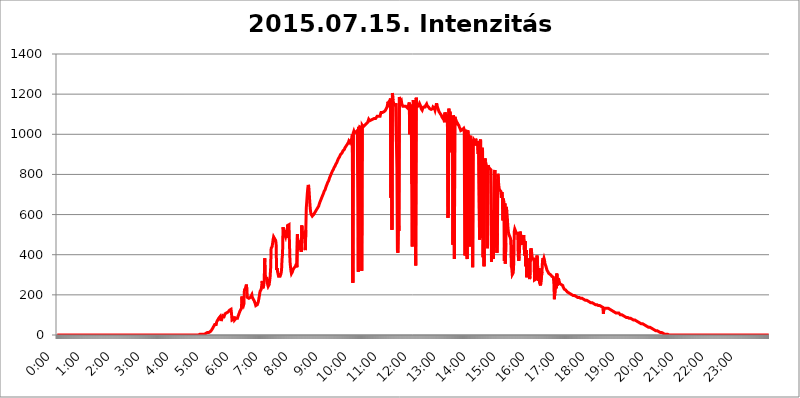
| Category | 2015.07.15. Intenzitás [W/m^2] |
|---|---|
| 0.0 | 0 |
| 0.0006944444444444445 | 0 |
| 0.001388888888888889 | 0 |
| 0.0020833333333333333 | 0 |
| 0.002777777777777778 | 0 |
| 0.003472222222222222 | 0 |
| 0.004166666666666667 | 0 |
| 0.004861111111111111 | 0 |
| 0.005555555555555556 | 0 |
| 0.0062499999999999995 | 0 |
| 0.006944444444444444 | 0 |
| 0.007638888888888889 | 0 |
| 0.008333333333333333 | 0 |
| 0.009027777777777779 | 0 |
| 0.009722222222222222 | 0 |
| 0.010416666666666666 | 0 |
| 0.011111111111111112 | 0 |
| 0.011805555555555555 | 0 |
| 0.012499999999999999 | 0 |
| 0.013194444444444444 | 0 |
| 0.013888888888888888 | 0 |
| 0.014583333333333332 | 0 |
| 0.015277777777777777 | 0 |
| 0.015972222222222224 | 0 |
| 0.016666666666666666 | 0 |
| 0.017361111111111112 | 0 |
| 0.018055555555555557 | 0 |
| 0.01875 | 0 |
| 0.019444444444444445 | 0 |
| 0.02013888888888889 | 0 |
| 0.020833333333333332 | 0 |
| 0.02152777777777778 | 0 |
| 0.022222222222222223 | 0 |
| 0.02291666666666667 | 0 |
| 0.02361111111111111 | 0 |
| 0.024305555555555556 | 0 |
| 0.024999999999999998 | 0 |
| 0.025694444444444447 | 0 |
| 0.02638888888888889 | 0 |
| 0.027083333333333334 | 0 |
| 0.027777777777777776 | 0 |
| 0.02847222222222222 | 0 |
| 0.029166666666666664 | 0 |
| 0.029861111111111113 | 0 |
| 0.030555555555555555 | 0 |
| 0.03125 | 0 |
| 0.03194444444444445 | 0 |
| 0.03263888888888889 | 0 |
| 0.03333333333333333 | 0 |
| 0.034027777777777775 | 0 |
| 0.034722222222222224 | 0 |
| 0.035416666666666666 | 0 |
| 0.036111111111111115 | 0 |
| 0.03680555555555556 | 0 |
| 0.0375 | 0 |
| 0.03819444444444444 | 0 |
| 0.03888888888888889 | 0 |
| 0.03958333333333333 | 0 |
| 0.04027777777777778 | 0 |
| 0.04097222222222222 | 0 |
| 0.041666666666666664 | 0 |
| 0.042361111111111106 | 0 |
| 0.04305555555555556 | 0 |
| 0.043750000000000004 | 0 |
| 0.044444444444444446 | 0 |
| 0.04513888888888889 | 0 |
| 0.04583333333333334 | 0 |
| 0.04652777777777778 | 0 |
| 0.04722222222222222 | 0 |
| 0.04791666666666666 | 0 |
| 0.04861111111111111 | 0 |
| 0.049305555555555554 | 0 |
| 0.049999999999999996 | 0 |
| 0.05069444444444445 | 0 |
| 0.051388888888888894 | 0 |
| 0.052083333333333336 | 0 |
| 0.05277777777777778 | 0 |
| 0.05347222222222222 | 0 |
| 0.05416666666666667 | 0 |
| 0.05486111111111111 | 0 |
| 0.05555555555555555 | 0 |
| 0.05625 | 0 |
| 0.05694444444444444 | 0 |
| 0.057638888888888885 | 0 |
| 0.05833333333333333 | 0 |
| 0.05902777777777778 | 0 |
| 0.059722222222222225 | 0 |
| 0.06041666666666667 | 0 |
| 0.061111111111111116 | 0 |
| 0.06180555555555556 | 0 |
| 0.0625 | 0 |
| 0.06319444444444444 | 0 |
| 0.06388888888888888 | 0 |
| 0.06458333333333334 | 0 |
| 0.06527777777777778 | 0 |
| 0.06597222222222222 | 0 |
| 0.06666666666666667 | 0 |
| 0.06736111111111111 | 0 |
| 0.06805555555555555 | 0 |
| 0.06874999999999999 | 0 |
| 0.06944444444444443 | 0 |
| 0.07013888888888889 | 0 |
| 0.07083333333333333 | 0 |
| 0.07152777777777779 | 0 |
| 0.07222222222222223 | 0 |
| 0.07291666666666667 | 0 |
| 0.07361111111111111 | 0 |
| 0.07430555555555556 | 0 |
| 0.075 | 0 |
| 0.07569444444444444 | 0 |
| 0.0763888888888889 | 0 |
| 0.07708333333333334 | 0 |
| 0.07777777777777778 | 0 |
| 0.07847222222222222 | 0 |
| 0.07916666666666666 | 0 |
| 0.0798611111111111 | 0 |
| 0.08055555555555556 | 0 |
| 0.08125 | 0 |
| 0.08194444444444444 | 0 |
| 0.08263888888888889 | 0 |
| 0.08333333333333333 | 0 |
| 0.08402777777777777 | 0 |
| 0.08472222222222221 | 0 |
| 0.08541666666666665 | 0 |
| 0.08611111111111112 | 0 |
| 0.08680555555555557 | 0 |
| 0.08750000000000001 | 0 |
| 0.08819444444444445 | 0 |
| 0.08888888888888889 | 0 |
| 0.08958333333333333 | 0 |
| 0.09027777777777778 | 0 |
| 0.09097222222222222 | 0 |
| 0.09166666666666667 | 0 |
| 0.09236111111111112 | 0 |
| 0.09305555555555556 | 0 |
| 0.09375 | 0 |
| 0.09444444444444444 | 0 |
| 0.09513888888888888 | 0 |
| 0.09583333333333333 | 0 |
| 0.09652777777777777 | 0 |
| 0.09722222222222222 | 0 |
| 0.09791666666666667 | 0 |
| 0.09861111111111111 | 0 |
| 0.09930555555555555 | 0 |
| 0.09999999999999999 | 0 |
| 0.10069444444444443 | 0 |
| 0.1013888888888889 | 0 |
| 0.10208333333333335 | 0 |
| 0.10277777777777779 | 0 |
| 0.10347222222222223 | 0 |
| 0.10416666666666667 | 0 |
| 0.10486111111111111 | 0 |
| 0.10555555555555556 | 0 |
| 0.10625 | 0 |
| 0.10694444444444444 | 0 |
| 0.1076388888888889 | 0 |
| 0.10833333333333334 | 0 |
| 0.10902777777777778 | 0 |
| 0.10972222222222222 | 0 |
| 0.1111111111111111 | 0 |
| 0.11180555555555556 | 0 |
| 0.11180555555555556 | 0 |
| 0.1125 | 0 |
| 0.11319444444444444 | 0 |
| 0.11388888888888889 | 0 |
| 0.11458333333333333 | 0 |
| 0.11527777777777777 | 0 |
| 0.11597222222222221 | 0 |
| 0.11666666666666665 | 0 |
| 0.1173611111111111 | 0 |
| 0.11805555555555557 | 0 |
| 0.11944444444444445 | 0 |
| 0.12013888888888889 | 0 |
| 0.12083333333333333 | 0 |
| 0.12152777777777778 | 0 |
| 0.12222222222222223 | 0 |
| 0.12291666666666667 | 0 |
| 0.12291666666666667 | 0 |
| 0.12361111111111112 | 0 |
| 0.12430555555555556 | 0 |
| 0.125 | 0 |
| 0.12569444444444444 | 0 |
| 0.12638888888888888 | 0 |
| 0.12708333333333333 | 0 |
| 0.16875 | 0 |
| 0.12847222222222224 | 0 |
| 0.12916666666666668 | 0 |
| 0.12986111111111112 | 0 |
| 0.13055555555555556 | 0 |
| 0.13125 | 0 |
| 0.13194444444444445 | 0 |
| 0.1326388888888889 | 0 |
| 0.13333333333333333 | 0 |
| 0.13402777777777777 | 0 |
| 0.13402777777777777 | 0 |
| 0.13472222222222222 | 0 |
| 0.13541666666666666 | 0 |
| 0.1361111111111111 | 0 |
| 0.13749999999999998 | 0 |
| 0.13819444444444443 | 0 |
| 0.1388888888888889 | 0 |
| 0.13958333333333334 | 0 |
| 0.14027777777777778 | 0 |
| 0.14097222222222222 | 0 |
| 0.14166666666666666 | 0 |
| 0.1423611111111111 | 0 |
| 0.14305555555555557 | 0 |
| 0.14375000000000002 | 0 |
| 0.14444444444444446 | 0 |
| 0.1451388888888889 | 0 |
| 0.1451388888888889 | 0 |
| 0.14652777777777778 | 0 |
| 0.14722222222222223 | 0 |
| 0.14791666666666667 | 0 |
| 0.1486111111111111 | 0 |
| 0.14930555555555555 | 0 |
| 0.15 | 0 |
| 0.15069444444444444 | 0 |
| 0.15138888888888888 | 0 |
| 0.15208333333333332 | 0 |
| 0.15277777777777776 | 0 |
| 0.15347222222222223 | 0 |
| 0.15416666666666667 | 0 |
| 0.15486111111111112 | 0 |
| 0.15555555555555556 | 0 |
| 0.15625 | 0 |
| 0.15694444444444444 | 0 |
| 0.15763888888888888 | 0 |
| 0.15833333333333333 | 0 |
| 0.15902777777777777 | 0 |
| 0.15972222222222224 | 0 |
| 0.16041666666666668 | 0 |
| 0.16111111111111112 | 0 |
| 0.16180555555555556 | 0 |
| 0.1625 | 0 |
| 0.16319444444444445 | 0 |
| 0.1638888888888889 | 0 |
| 0.16458333333333333 | 0 |
| 0.16527777777777777 | 0 |
| 0.16597222222222222 | 0 |
| 0.16666666666666666 | 0 |
| 0.1673611111111111 | 0 |
| 0.16805555555555554 | 0 |
| 0.16874999999999998 | 0 |
| 0.16944444444444443 | 0 |
| 0.17013888888888887 | 0 |
| 0.1708333333333333 | 0 |
| 0.17152777777777775 | 0 |
| 0.17222222222222225 | 0 |
| 0.1729166666666667 | 0 |
| 0.17361111111111113 | 0 |
| 0.17430555555555557 | 0 |
| 0.17500000000000002 | 0 |
| 0.17569444444444446 | 0 |
| 0.1763888888888889 | 0 |
| 0.17708333333333334 | 0 |
| 0.17777777777777778 | 0 |
| 0.17847222222222223 | 0 |
| 0.17916666666666667 | 0 |
| 0.1798611111111111 | 0 |
| 0.18055555555555555 | 0 |
| 0.18125 | 0 |
| 0.18194444444444444 | 0 |
| 0.1826388888888889 | 0 |
| 0.18333333333333335 | 0 |
| 0.1840277777777778 | 0 |
| 0.18472222222222223 | 0 |
| 0.18541666666666667 | 0 |
| 0.18611111111111112 | 0 |
| 0.18680555555555556 | 0 |
| 0.1875 | 0 |
| 0.18819444444444444 | 0 |
| 0.18888888888888888 | 0 |
| 0.18958333333333333 | 0 |
| 0.19027777777777777 | 0 |
| 0.1909722222222222 | 0 |
| 0.19166666666666665 | 0 |
| 0.19236111111111112 | 0 |
| 0.19305555555555554 | 0 |
| 0.19375 | 0 |
| 0.19444444444444445 | 0 |
| 0.1951388888888889 | 0 |
| 0.19583333333333333 | 0 |
| 0.19652777777777777 | 0 |
| 0.19722222222222222 | 0 |
| 0.19791666666666666 | 0 |
| 0.1986111111111111 | 0 |
| 0.19930555555555554 | 3.525 |
| 0.19999999999999998 | 3.525 |
| 0.20069444444444443 | 3.525 |
| 0.20138888888888887 | 3.525 |
| 0.2020833333333333 | 3.525 |
| 0.2027777777777778 | 3.525 |
| 0.2034722222222222 | 3.525 |
| 0.2041666666666667 | 3.525 |
| 0.20486111111111113 | 3.525 |
| 0.20555555555555557 | 3.525 |
| 0.20625000000000002 | 3.525 |
| 0.20694444444444446 | 7.887 |
| 0.2076388888888889 | 7.887 |
| 0.20833333333333334 | 7.887 |
| 0.20902777777777778 | 7.887 |
| 0.20972222222222223 | 7.887 |
| 0.21041666666666667 | 12.257 |
| 0.2111111111111111 | 12.257 |
| 0.21180555555555555 | 12.257 |
| 0.2125 | 12.257 |
| 0.21319444444444444 | 12.257 |
| 0.2138888888888889 | 16.636 |
| 0.21458333333333335 | 16.636 |
| 0.2152777777777778 | 16.636 |
| 0.21597222222222223 | 21.024 |
| 0.21666666666666667 | 25.419 |
| 0.21736111111111112 | 25.419 |
| 0.21805555555555556 | 34.234 |
| 0.21875 | 38.653 |
| 0.21944444444444444 | 43.079 |
| 0.22013888888888888 | 47.511 |
| 0.22083333333333333 | 51.951 |
| 0.22152777777777777 | 56.398 |
| 0.2222222222222222 | 51.951 |
| 0.22291666666666665 | 51.951 |
| 0.2236111111111111 | 65.31 |
| 0.22430555555555556 | 65.31 |
| 0.225 | 74.246 |
| 0.22569444444444445 | 78.722 |
| 0.2263888888888889 | 83.205 |
| 0.22708333333333333 | 87.692 |
| 0.22777777777777777 | 87.692 |
| 0.22847222222222222 | 92.184 |
| 0.22916666666666666 | 83.205 |
| 0.2298611111111111 | 69.775 |
| 0.23055555555555554 | 65.31 |
| 0.23124999999999998 | 87.692 |
| 0.23194444444444443 | 96.682 |
| 0.23263888888888887 | 101.184 |
| 0.2333333333333333 | 101.184 |
| 0.2340277777777778 | 92.184 |
| 0.2347222222222222 | 96.682 |
| 0.2354166666666667 | 105.69 |
| 0.23611111111111113 | 105.69 |
| 0.23680555555555557 | 110.201 |
| 0.23750000000000002 | 110.201 |
| 0.23819444444444446 | 110.201 |
| 0.2388888888888889 | 114.716 |
| 0.23958333333333334 | 114.716 |
| 0.24027777777777778 | 119.235 |
| 0.24097222222222223 | 119.235 |
| 0.24166666666666667 | 123.758 |
| 0.2423611111111111 | 128.284 |
| 0.24305555555555555 | 128.284 |
| 0.24375 | 128.284 |
| 0.24444444444444446 | 105.69 |
| 0.24513888888888888 | 74.246 |
| 0.24583333333333335 | 74.246 |
| 0.2465277777777778 | 78.722 |
| 0.24722222222222223 | 78.722 |
| 0.24791666666666667 | 92.184 |
| 0.24861111111111112 | 74.246 |
| 0.24930555555555556 | 74.246 |
| 0.25 | 78.722 |
| 0.25069444444444444 | 83.205 |
| 0.2513888888888889 | 83.205 |
| 0.2520833333333333 | 83.205 |
| 0.25277777777777777 | 83.205 |
| 0.2534722222222222 | 92.184 |
| 0.25416666666666665 | 96.682 |
| 0.2548611111111111 | 105.69 |
| 0.2555555555555556 | 110.201 |
| 0.25625000000000003 | 119.235 |
| 0.2569444444444445 | 123.758 |
| 0.2576388888888889 | 123.758 |
| 0.25833333333333336 | 132.814 |
| 0.2590277777777778 | 191.937 |
| 0.25972222222222224 | 155.509 |
| 0.2604166666666667 | 150.964 |
| 0.2611111111111111 | 146.423 |
| 0.26180555555555557 | 155.509 |
| 0.2625 | 223.873 |
| 0.26319444444444445 | 228.436 |
| 0.2638888888888889 | 233 |
| 0.26458333333333334 | 242.127 |
| 0.2652777777777778 | 251.251 |
| 0.2659722222222222 | 223.873 |
| 0.26666666666666666 | 187.378 |
| 0.2673611111111111 | 191.937 |
| 0.26805555555555555 | 182.82 |
| 0.26875 | 182.82 |
| 0.26944444444444443 | 182.82 |
| 0.2701388888888889 | 182.82 |
| 0.2708333333333333 | 187.378 |
| 0.27152777777777776 | 191.937 |
| 0.2722222222222222 | 191.937 |
| 0.27291666666666664 | 201.058 |
| 0.2736111111111111 | 187.378 |
| 0.2743055555555555 | 182.82 |
| 0.27499999999999997 | 178.264 |
| 0.27569444444444446 | 173.709 |
| 0.27638888888888885 | 169.156 |
| 0.27708333333333335 | 164.605 |
| 0.2777777777777778 | 155.509 |
| 0.27847222222222223 | 146.423 |
| 0.2791666666666667 | 146.423 |
| 0.2798611111111111 | 150.964 |
| 0.28055555555555556 | 150.964 |
| 0.28125 | 155.509 |
| 0.28194444444444444 | 164.605 |
| 0.2826388888888889 | 178.264 |
| 0.2833333333333333 | 191.937 |
| 0.28402777777777777 | 210.182 |
| 0.2847222222222222 | 219.309 |
| 0.28541666666666665 | 223.873 |
| 0.28611111111111115 | 228.436 |
| 0.28680555555555554 | 246.689 |
| 0.28750000000000003 | 269.49 |
| 0.2881944444444445 | 233 |
| 0.2888888888888889 | 237.564 |
| 0.28958333333333336 | 246.689 |
| 0.2902777777777778 | 269.49 |
| 0.29097222222222224 | 382.715 |
| 0.2916666666666667 | 283.156 |
| 0.2923611111111111 | 283.156 |
| 0.29305555555555557 | 278.603 |
| 0.29375 | 283.156 |
| 0.29444444444444445 | 264.932 |
| 0.2951388888888889 | 251.251 |
| 0.29583333333333334 | 242.127 |
| 0.2965277777777778 | 242.127 |
| 0.2972222222222222 | 251.251 |
| 0.29791666666666666 | 269.49 |
| 0.2986111111111111 | 292.259 |
| 0.29930555555555555 | 333.113 |
| 0.3 | 431.833 |
| 0.30069444444444443 | 431.833 |
| 0.3013888888888889 | 440.702 |
| 0.3020833333333333 | 458.38 |
| 0.30277777777777776 | 475.972 |
| 0.3034722222222222 | 489.108 |
| 0.30416666666666664 | 489.108 |
| 0.3048611111111111 | 480.356 |
| 0.3055555555555555 | 480.356 |
| 0.30624999999999997 | 471.582 |
| 0.3069444444444444 | 458.38 |
| 0.3076388888888889 | 324.052 |
| 0.30833333333333335 | 333.113 |
| 0.3090277777777778 | 314.98 |
| 0.30972222222222223 | 314.98 |
| 0.3104166666666667 | 292.259 |
| 0.3111111111111111 | 287.709 |
| 0.31180555555555556 | 287.709 |
| 0.3125 | 292.259 |
| 0.31319444444444444 | 296.808 |
| 0.3138888888888889 | 305.898 |
| 0.3145833333333333 | 324.052 |
| 0.31527777777777777 | 378.224 |
| 0.3159722222222222 | 400.638 |
| 0.31666666666666665 | 536.82 |
| 0.31736111111111115 | 523.88 |
| 0.31805555555555554 | 515.223 |
| 0.31875000000000003 | 502.192 |
| 0.3194444444444445 | 497.836 |
| 0.3201388888888889 | 489.108 |
| 0.32083333333333336 | 502.192 |
| 0.3215277777777778 | 523.88 |
| 0.32222222222222224 | 484.735 |
| 0.3229166666666667 | 545.416 |
| 0.3236111111111111 | 541.121 |
| 0.32430555555555557 | 541.121 |
| 0.325 | 549.704 |
| 0.32569444444444445 | 549.704 |
| 0.3263888888888889 | 369.23 |
| 0.32708333333333334 | 342.162 |
| 0.3277777777777778 | 319.517 |
| 0.3284722222222222 | 305.898 |
| 0.32916666666666666 | 305.898 |
| 0.3298611111111111 | 314.98 |
| 0.33055555555555555 | 324.052 |
| 0.33125 | 328.584 |
| 0.33194444444444443 | 333.113 |
| 0.3326388888888889 | 337.639 |
| 0.3333333333333333 | 337.639 |
| 0.3340277777777778 | 342.162 |
| 0.3347222222222222 | 346.682 |
| 0.3354166666666667 | 355.712 |
| 0.3361111111111111 | 337.639 |
| 0.3368055555555556 | 502.192 |
| 0.33749999999999997 | 458.38 |
| 0.33819444444444446 | 427.39 |
| 0.33888888888888885 | 422.943 |
| 0.33958333333333335 | 422.943 |
| 0.34027777777777773 | 431.833 |
| 0.34097222222222223 | 449.551 |
| 0.3416666666666666 | 471.582 |
| 0.3423611111111111 | 414.035 |
| 0.3430555555555555 | 545.416 |
| 0.34375 | 480.356 |
| 0.3444444444444445 | 489.108 |
| 0.3451388888888889 | 480.356 |
| 0.3458333333333334 | 493.475 |
| 0.34652777777777777 | 497.836 |
| 0.34722222222222227 | 515.223 |
| 0.34791666666666665 | 422.943 |
| 0.34861111111111115 | 523.88 |
| 0.34930555555555554 | 634.105 |
| 0.35000000000000003 | 667.123 |
| 0.3506944444444444 | 703.762 |
| 0.3513888888888889 | 731.896 |
| 0.3520833333333333 | 747.834 |
| 0.3527777777777778 | 739.877 |
| 0.3534722222222222 | 703.762 |
| 0.3541666666666667 | 663.019 |
| 0.3548611111111111 | 629.948 |
| 0.35555555555555557 | 609.062 |
| 0.35625 | 600.661 |
| 0.35694444444444445 | 596.45 |
| 0.3576388888888889 | 592.233 |
| 0.35833333333333334 | 592.233 |
| 0.3590277777777778 | 596.45 |
| 0.3597222222222222 | 600.661 |
| 0.36041666666666666 | 604.864 |
| 0.3611111111111111 | 609.062 |
| 0.36180555555555555 | 613.252 |
| 0.3625 | 617.436 |
| 0.36319444444444443 | 621.613 |
| 0.3638888888888889 | 625.784 |
| 0.3645833333333333 | 629.948 |
| 0.3652777777777778 | 634.105 |
| 0.3659722222222222 | 638.256 |
| 0.3666666666666667 | 642.4 |
| 0.3673611111111111 | 650.667 |
| 0.3680555555555556 | 658.909 |
| 0.36874999999999997 | 663.019 |
| 0.36944444444444446 | 671.22 |
| 0.37013888888888885 | 675.311 |
| 0.37083333333333335 | 683.473 |
| 0.37152777777777773 | 687.544 |
| 0.37222222222222223 | 695.666 |
| 0.3729166666666666 | 699.717 |
| 0.3736111111111111 | 707.8 |
| 0.3743055555555555 | 715.858 |
| 0.375 | 719.877 |
| 0.3756944444444445 | 723.889 |
| 0.3763888888888889 | 727.896 |
| 0.3770833333333334 | 739.877 |
| 0.37777777777777777 | 743.859 |
| 0.37847222222222227 | 751.803 |
| 0.37916666666666665 | 759.723 |
| 0.37986111111111115 | 763.674 |
| 0.38055555555555554 | 767.62 |
| 0.38125000000000003 | 775.492 |
| 0.3819444444444444 | 783.342 |
| 0.3826388888888889 | 787.258 |
| 0.3833333333333333 | 795.074 |
| 0.3840277777777778 | 798.974 |
| 0.3847222222222222 | 806.757 |
| 0.3854166666666667 | 810.641 |
| 0.3861111111111111 | 818.392 |
| 0.38680555555555557 | 822.26 |
| 0.3875 | 826.123 |
| 0.38819444444444445 | 833.834 |
| 0.3888888888888889 | 837.682 |
| 0.38958333333333334 | 841.526 |
| 0.3902777777777778 | 845.365 |
| 0.3909722222222222 | 853.029 |
| 0.39166666666666666 | 856.855 |
| 0.3923611111111111 | 860.676 |
| 0.39305555555555555 | 868.305 |
| 0.39375 | 872.114 |
| 0.39444444444444443 | 879.719 |
| 0.3951388888888889 | 883.516 |
| 0.3958333333333333 | 887.309 |
| 0.3965277777777778 | 891.099 |
| 0.3972222222222222 | 898.668 |
| 0.3979166666666667 | 898.668 |
| 0.3986111111111111 | 902.447 |
| 0.3993055555555556 | 906.223 |
| 0.39999999999999997 | 909.996 |
| 0.40069444444444446 | 917.534 |
| 0.40138888888888885 | 917.534 |
| 0.40208333333333335 | 921.298 |
| 0.40277777777777773 | 925.06 |
| 0.40347222222222223 | 932.576 |
| 0.4041666666666666 | 932.576 |
| 0.4048611111111111 | 940.082 |
| 0.4055555555555555 | 943.832 |
| 0.40625 | 947.58 |
| 0.4069444444444445 | 947.58 |
| 0.4076388888888889 | 951.327 |
| 0.4083333333333334 | 958.814 |
| 0.40902777777777777 | 966.295 |
| 0.40972222222222227 | 962.555 |
| 0.41041666666666665 | 958.814 |
| 0.41111111111111115 | 966.295 |
| 0.41180555555555554 | 970.034 |
| 0.41250000000000003 | 973.772 |
| 0.4131944444444444 | 981.244 |
| 0.4138888888888889 | 999.916 |
| 0.4145833333333333 | 260.373 |
| 0.4152777777777778 | 1007.383 |
| 0.4159722222222222 | 1014.852 |
| 0.4166666666666667 | 1007.383 |
| 0.4173611111111111 | 1011.118 |
| 0.41805555555555557 | 1011.118 |
| 0.41875 | 1011.118 |
| 0.41944444444444445 | 1011.118 |
| 0.4201388888888889 | 1014.852 |
| 0.42083333333333334 | 1018.587 |
| 0.4215277777777778 | 1014.852 |
| 0.4222222222222222 | 314.98 |
| 0.42291666666666666 | 1037.277 |
| 0.4236111111111111 | 1022.323 |
| 0.42430555555555555 | 1037.277 |
| 0.425 | 1033.537 |
| 0.42569444444444443 | 1033.537 |
| 0.4263888888888889 | 1033.537 |
| 0.4270833333333333 | 319.517 |
| 0.4277777777777778 | 1044.762 |
| 0.4284722222222222 | 1041.019 |
| 0.4291666666666667 | 1037.277 |
| 0.4298611111111111 | 1041.019 |
| 0.4305555555555556 | 1041.019 |
| 0.43124999999999997 | 1044.762 |
| 0.43194444444444446 | 1044.762 |
| 0.43263888888888885 | 1048.508 |
| 0.43333333333333335 | 1052.255 |
| 0.43402777777777773 | 1056.004 |
| 0.43472222222222223 | 1052.255 |
| 0.4354166666666666 | 1059.756 |
| 0.4361111111111111 | 1067.267 |
| 0.4368055555555555 | 1074.789 |
| 0.4375 | 1071.027 |
| 0.4381944444444445 | 1067.267 |
| 0.4388888888888889 | 1067.267 |
| 0.4395833333333334 | 1067.267 |
| 0.44027777777777777 | 1071.027 |
| 0.44097222222222227 | 1071.027 |
| 0.44166666666666665 | 1074.789 |
| 0.44236111111111115 | 1074.789 |
| 0.44305555555555554 | 1074.789 |
| 0.44375000000000003 | 1071.027 |
| 0.4444444444444444 | 1078.555 |
| 0.4451388888888889 | 1074.789 |
| 0.4458333333333333 | 1082.324 |
| 0.4465277777777778 | 1078.555 |
| 0.4472222222222222 | 1078.555 |
| 0.4479166666666667 | 1082.324 |
| 0.4486111111111111 | 1089.873 |
| 0.44930555555555557 | 1093.653 |
| 0.45 | 1089.873 |
| 0.45069444444444445 | 1089.873 |
| 0.4513888888888889 | 1089.873 |
| 0.45208333333333334 | 1089.873 |
| 0.4527777777777778 | 1089.873 |
| 0.4534722222222222 | 1101.226 |
| 0.45416666666666666 | 1108.816 |
| 0.4548611111111111 | 1108.816 |
| 0.45555555555555555 | 1108.816 |
| 0.45625 | 1108.816 |
| 0.45694444444444443 | 1105.019 |
| 0.4576388888888889 | 1108.816 |
| 0.4583333333333333 | 1112.618 |
| 0.4590277777777778 | 1116.426 |
| 0.4597222222222222 | 1116.426 |
| 0.4604166666666667 | 1120.238 |
| 0.4611111111111111 | 1124.056 |
| 0.4618055555555556 | 1124.056 |
| 0.46249999999999997 | 1135.543 |
| 0.46319444444444446 | 1147.086 |
| 0.46388888888888885 | 1162.571 |
| 0.46458333333333335 | 1154.814 |
| 0.46527777777777773 | 1162.571 |
| 0.46597222222222223 | 1166.46 |
| 0.4666666666666666 | 1170.358 |
| 0.4673611111111111 | 1178.177 |
| 0.4680555555555555 | 683.473 |
| 0.46875 | 1170.358 |
| 0.4694444444444445 | 523.88 |
| 0.4701388888888889 | 1205.82 |
| 0.4708333333333334 | 1170.358 |
| 0.47152777777777777 | 1158.689 |
| 0.47222222222222227 | 1150.946 |
| 0.47291666666666665 | 1150.946 |
| 0.47361111111111115 | 1147.086 |
| 0.47430555555555554 | 1143.232 |
| 0.47500000000000003 | 1154.814 |
| 0.4756944444444444 | 962.555 |
| 0.4763888888888889 | 833.834 |
| 0.4770833333333333 | 422.943 |
| 0.4777777777777778 | 409.574 |
| 0.4784722222222222 | 566.793 |
| 0.4791666666666667 | 519.555 |
| 0.4798611111111111 | 1186.03 |
| 0.48055555555555557 | 1170.358 |
| 0.48125 | 1158.689 |
| 0.48194444444444445 | 1162.571 |
| 0.4826388888888889 | 1166.46 |
| 0.48333333333333334 | 1150.946 |
| 0.4840277777777778 | 1147.086 |
| 0.4847222222222222 | 1139.384 |
| 0.48541666666666666 | 1135.543 |
| 0.4861111111111111 | 1139.384 |
| 0.48680555555555555 | 1139.384 |
| 0.4875 | 1139.384 |
| 0.48819444444444443 | 1139.384 |
| 0.4888888888888889 | 1139.384 |
| 0.4895833333333333 | 1135.543 |
| 0.4902777777777778 | 1139.384 |
| 0.4909722222222222 | 1131.708 |
| 0.4916666666666667 | 1135.543 |
| 0.4923611111111111 | 1139.384 |
| 0.4930555555555556 | 1139.384 |
| 0.49374999999999997 | 1158.689 |
| 0.49444444444444446 | 999.916 |
| 0.49513888888888885 | 1147.086 |
| 0.49583333333333335 | 1105.019 |
| 0.49652777777777773 | 1147.086 |
| 0.49722222222222223 | 751.803 |
| 0.4979166666666666 | 440.702 |
| 0.4986111111111111 | 1101.226 |
| 0.4993055555555555 | 1170.358 |
| 0.5 | 1150.946 |
| 0.5006944444444444 | 1143.232 |
| 0.5013888888888889 | 1139.384 |
| 0.5020833333333333 | 1139.384 |
| 0.5027777777777778 | 346.682 |
| 0.5034722222222222 | 1182.099 |
| 0.5041666666666667 | 1158.689 |
| 0.5048611111111111 | 1147.086 |
| 0.5055555555555555 | 1139.384 |
| 0.50625 | 1139.384 |
| 0.5069444444444444 | 1139.384 |
| 0.5076388888888889 | 1143.232 |
| 0.5083333333333333 | 1150.946 |
| 0.5090277777777777 | 1154.814 |
| 0.5097222222222222 | 1139.384 |
| 0.5104166666666666 | 1127.879 |
| 0.5111111111111112 | 1124.056 |
| 0.5118055555555555 | 1120.238 |
| 0.5125000000000001 | 1127.879 |
| 0.5131944444444444 | 1131.708 |
| 0.513888888888889 | 1135.543 |
| 0.5145833333333333 | 1139.384 |
| 0.5152777777777778 | 1135.543 |
| 0.5159722222222222 | 1135.543 |
| 0.5166666666666667 | 1143.232 |
| 0.517361111111111 | 1143.232 |
| 0.5180555555555556 | 1150.946 |
| 0.5187499999999999 | 1143.232 |
| 0.5194444444444445 | 1139.384 |
| 0.5201388888888888 | 1139.384 |
| 0.5208333333333334 | 1135.543 |
| 0.5215277777777778 | 1131.708 |
| 0.5222222222222223 | 1127.879 |
| 0.5229166666666667 | 1127.879 |
| 0.5236111111111111 | 1127.879 |
| 0.5243055555555556 | 1124.056 |
| 0.525 | 1124.056 |
| 0.5256944444444445 | 1127.879 |
| 0.5263888888888889 | 1127.879 |
| 0.5270833333333333 | 1135.543 |
| 0.5277777777777778 | 1131.708 |
| 0.5284722222222222 | 1131.708 |
| 0.5291666666666667 | 1127.879 |
| 0.5298611111111111 | 1120.238 |
| 0.5305555555555556 | 1116.426 |
| 0.53125 | 1143.232 |
| 0.5319444444444444 | 1154.814 |
| 0.5326388888888889 | 1143.232 |
| 0.5333333333333333 | 1135.543 |
| 0.5340277777777778 | 1127.879 |
| 0.5347222222222222 | 1124.056 |
| 0.5354166666666667 | 1112.618 |
| 0.5361111111111111 | 1116.426 |
| 0.5368055555555555 | 1108.816 |
| 0.5375 | 1101.226 |
| 0.5381944444444444 | 1097.437 |
| 0.5388888888888889 | 1093.653 |
| 0.5395833333333333 | 1086.097 |
| 0.5402777777777777 | 1082.324 |
| 0.5409722222222222 | 1078.555 |
| 0.5416666666666666 | 1078.555 |
| 0.5423611111111112 | 1086.097 |
| 0.5430555555555555 | 1059.756 |
| 0.5437500000000001 | 1108.816 |
| 0.5444444444444444 | 1101.226 |
| 0.545138888888889 | 1097.437 |
| 0.5458333333333333 | 1093.653 |
| 0.5465277777777778 | 1086.097 |
| 0.5472222222222222 | 1097.437 |
| 0.5479166666666667 | 583.779 |
| 0.548611111111111 | 613.252 |
| 0.5493055555555556 | 1127.879 |
| 0.5499999999999999 | 909.996 |
| 0.5506944444444445 | 1112.618 |
| 0.5513888888888888 | 1097.437 |
| 0.5520833333333334 | 1086.097 |
| 0.5527777777777778 | 1078.555 |
| 0.5534722222222223 | 1074.789 |
| 0.5541666666666667 | 1071.027 |
| 0.5548611111111111 | 449.551 |
| 0.5555555555555556 | 1093.653 |
| 0.55625 | 1086.097 |
| 0.5569444444444445 | 378.224 |
| 0.5576388888888889 | 1086.097 |
| 0.5583333333333333 | 1078.555 |
| 0.5590277777777778 | 1078.555 |
| 0.5597222222222222 | 1074.789 |
| 0.5604166666666667 | 1059.756 |
| 0.5611111111111111 | 1044.762 |
| 0.5618055555555556 | 1052.255 |
| 0.5625 | 1048.508 |
| 0.5631944444444444 | 1044.762 |
| 0.5638888888888889 | 1037.277 |
| 0.5645833333333333 | 1033.537 |
| 0.5652777777777778 | 1026.06 |
| 0.5659722222222222 | 1018.587 |
| 0.5666666666666667 | 1018.587 |
| 0.5673611111111111 | 1022.323 |
| 0.5680555555555555 | 1022.323 |
| 0.56875 | 1022.323 |
| 0.5694444444444444 | 1018.587 |
| 0.5701388888888889 | 1029.798 |
| 0.5708333333333333 | 1022.323 |
| 0.5715277777777777 | 396.164 |
| 0.5722222222222222 | 405.108 |
| 0.5729166666666666 | 1022.323 |
| 0.5736111111111112 | 1022.323 |
| 0.5743055555555555 | 396.164 |
| 0.5750000000000001 | 378.224 |
| 0.5756944444444444 | 1018.587 |
| 0.576388888888889 | 1003.65 |
| 0.5770833333333333 | 992.448 |
| 0.5777777777777778 | 984.98 |
| 0.5784722222222222 | 440.702 |
| 0.5791666666666667 | 992.448 |
| 0.579861111111111 | 845.365 |
| 0.5805555555555556 | 973.772 |
| 0.5812499999999999 | 970.034 |
| 0.5819444444444445 | 936.33 |
| 0.5826388888888888 | 337.639 |
| 0.5833333333333334 | 955.071 |
| 0.5840277777777778 | 973.772 |
| 0.5847222222222223 | 970.034 |
| 0.5854166666666667 | 966.295 |
| 0.5861111111111111 | 943.832 |
| 0.5868055555555556 | 977.508 |
| 0.5875 | 970.034 |
| 0.5881944444444445 | 955.071 |
| 0.5888888888888889 | 951.327 |
| 0.5895833333333333 | 940.082 |
| 0.5902777777777778 | 902.447 |
| 0.5909722222222222 | 966.295 |
| 0.5916666666666667 | 970.034 |
| 0.5923611111111111 | 475.972 |
| 0.5930555555555556 | 966.295 |
| 0.59375 | 973.772 |
| 0.5944444444444444 | 484.735 |
| 0.5951388888888889 | 506.542 |
| 0.5958333333333333 | 932.576 |
| 0.5965277777777778 | 917.534 |
| 0.5972222222222222 | 387.202 |
| 0.5979166666666667 | 723.889 |
| 0.5986111111111111 | 342.162 |
| 0.5993055555555555 | 814.519 |
| 0.6 | 879.719 |
| 0.6006944444444444 | 864.493 |
| 0.6013888888888889 | 853.029 |
| 0.6020833333333333 | 841.526 |
| 0.6027777777777777 | 833.834 |
| 0.6034722222222222 | 431.833 |
| 0.6041666666666666 | 845.365 |
| 0.6048611111111112 | 837.682 |
| 0.6055555555555555 | 833.834 |
| 0.6062500000000001 | 829.981 |
| 0.6069444444444444 | 833.834 |
| 0.607638888888889 | 826.123 |
| 0.6083333333333333 | 822.26 |
| 0.6090277777777778 | 364.728 |
| 0.6097222222222222 | 360.221 |
| 0.6104166666666667 | 364.728 |
| 0.611111111111111 | 621.613 |
| 0.6118055555555556 | 378.224 |
| 0.6124999999999999 | 382.715 |
| 0.6131944444444445 | 814.519 |
| 0.6138888888888888 | 822.26 |
| 0.6145833333333334 | 449.551 |
| 0.6152777777777778 | 436.27 |
| 0.6159722222222223 | 775.492 |
| 0.6166666666666667 | 409.574 |
| 0.6173611111111111 | 506.542 |
| 0.6180555555555556 | 802.868 |
| 0.61875 | 767.62 |
| 0.6194444444444445 | 739.877 |
| 0.6201388888888889 | 723.889 |
| 0.6208333333333333 | 727.896 |
| 0.6215277777777778 | 719.877 |
| 0.6222222222222222 | 715.858 |
| 0.6229166666666667 | 683.473 |
| 0.6236111111111111 | 711.832 |
| 0.6243055555555556 | 683.473 |
| 0.625 | 571.049 |
| 0.6256944444444444 | 679.395 |
| 0.6263888888888889 | 658.909 |
| 0.6270833333333333 | 369.23 |
| 0.6277777777777778 | 654.791 |
| 0.6284722222222222 | 355.712 |
| 0.6291666666666667 | 458.38 |
| 0.6298611111111111 | 638.256 |
| 0.6305555555555555 | 613.252 |
| 0.63125 | 583.779 |
| 0.6319444444444444 | 541.121 |
| 0.6326388888888889 | 515.223 |
| 0.6333333333333333 | 502.192 |
| 0.6340277777777777 | 502.192 |
| 0.6347222222222222 | 497.836 |
| 0.6354166666666666 | 484.735 |
| 0.6361111111111112 | 471.582 |
| 0.6368055555555555 | 342.162 |
| 0.6375000000000001 | 333.113 |
| 0.6381944444444444 | 301.354 |
| 0.638888888888889 | 305.898 |
| 0.6395833333333333 | 310.44 |
| 0.6402777777777778 | 360.221 |
| 0.6409722222222222 | 515.223 |
| 0.6416666666666667 | 528.2 |
| 0.642361111111111 | 523.88 |
| 0.6430555555555556 | 515.223 |
| 0.6437499999999999 | 506.542 |
| 0.6444444444444445 | 502.192 |
| 0.6451388888888888 | 506.542 |
| 0.6458333333333334 | 506.542 |
| 0.6465277777777778 | 396.164 |
| 0.6472222222222223 | 369.23 |
| 0.6479166666666667 | 387.202 |
| 0.6486111111111111 | 382.715 |
| 0.6493055555555556 | 515.223 |
| 0.65 | 497.836 |
| 0.6506944444444445 | 484.735 |
| 0.6513888888888889 | 458.38 |
| 0.6520833333333333 | 449.551 |
| 0.6527777777777778 | 462.786 |
| 0.6534722222222222 | 484.735 |
| 0.6541666666666667 | 497.836 |
| 0.6548611111111111 | 493.475 |
| 0.6555555555555556 | 396.164 |
| 0.65625 | 467.187 |
| 0.6569444444444444 | 342.162 |
| 0.6576388888888889 | 422.943 |
| 0.6583333333333333 | 287.709 |
| 0.6590277777777778 | 382.715 |
| 0.6597222222222222 | 310.44 |
| 0.6604166666666667 | 328.584 |
| 0.6611111111111111 | 324.052 |
| 0.6618055555555555 | 301.354 |
| 0.6625 | 278.603 |
| 0.6631944444444444 | 292.259 |
| 0.6638888888888889 | 422.943 |
| 0.6645833333333333 | 431.833 |
| 0.6652777777777777 | 414.035 |
| 0.6659722222222222 | 391.685 |
| 0.6666666666666666 | 378.224 |
| 0.6673611111111111 | 373.729 |
| 0.6680555555555556 | 382.715 |
| 0.6687500000000001 | 378.224 |
| 0.6694444444444444 | 274.047 |
| 0.6701388888888888 | 269.49 |
| 0.6708333333333334 | 269.49 |
| 0.6715277777777778 | 278.603 |
| 0.6722222222222222 | 310.44 |
| 0.6729166666666666 | 396.164 |
| 0.6736111111111112 | 360.221 |
| 0.6743055555555556 | 283.156 |
| 0.6749999999999999 | 269.49 |
| 0.6756944444444444 | 333.113 |
| 0.6763888888888889 | 260.373 |
| 0.6770833333333334 | 255.813 |
| 0.6777777777777777 | 246.689 |
| 0.6784722222222223 | 246.689 |
| 0.6791666666666667 | 246.689 |
| 0.6798611111111111 | 314.98 |
| 0.6805555555555555 | 369.23 |
| 0.68125 | 382.715 |
| 0.6819444444444445 | 373.729 |
| 0.6826388888888889 | 382.715 |
| 0.6833333333333332 | 373.729 |
| 0.6840277777777778 | 355.712 |
| 0.6847222222222222 | 351.198 |
| 0.6854166666666667 | 342.162 |
| 0.686111111111111 | 337.639 |
| 0.6868055555555556 | 324.052 |
| 0.6875 | 319.517 |
| 0.6881944444444444 | 314.98 |
| 0.688888888888889 | 310.44 |
| 0.6895833333333333 | 305.898 |
| 0.6902777777777778 | 305.898 |
| 0.6909722222222222 | 305.898 |
| 0.6916666666666668 | 301.354 |
| 0.6923611111111111 | 301.354 |
| 0.6930555555555555 | 296.808 |
| 0.69375 | 292.259 |
| 0.6944444444444445 | 292.259 |
| 0.6951388888888889 | 287.709 |
| 0.6958333333333333 | 287.709 |
| 0.6965277777777777 | 255.813 |
| 0.6972222222222223 | 178.264 |
| 0.6979166666666666 | 173.709 |
| 0.6986111111111111 | 242.127 |
| 0.6993055555555556 | 278.603 |
| 0.7000000000000001 | 233 |
| 0.7006944444444444 | 305.898 |
| 0.7013888888888888 | 246.689 |
| 0.7020833333333334 | 251.251 |
| 0.7027777777777778 | 283.156 |
| 0.7034722222222222 | 274.047 |
| 0.7041666666666666 | 269.49 |
| 0.7048611111111112 | 255.813 |
| 0.7055555555555556 | 251.251 |
| 0.7062499999999999 | 251.251 |
| 0.7069444444444444 | 251.251 |
| 0.7076388888888889 | 251.251 |
| 0.7083333333333334 | 251.251 |
| 0.7090277777777777 | 246.689 |
| 0.7097222222222223 | 237.564 |
| 0.7104166666666667 | 233 |
| 0.7111111111111111 | 228.436 |
| 0.7118055555555555 | 228.436 |
| 0.7125 | 228.436 |
| 0.7131944444444445 | 223.873 |
| 0.7138888888888889 | 219.309 |
| 0.7145833333333332 | 219.309 |
| 0.7152777777777778 | 214.746 |
| 0.7159722222222222 | 214.746 |
| 0.7166666666666667 | 210.182 |
| 0.717361111111111 | 210.182 |
| 0.7180555555555556 | 205.62 |
| 0.71875 | 205.62 |
| 0.7194444444444444 | 205.62 |
| 0.720138888888889 | 201.058 |
| 0.7208333333333333 | 201.058 |
| 0.7215277777777778 | 201.058 |
| 0.7222222222222222 | 201.058 |
| 0.7229166666666668 | 201.058 |
| 0.7236111111111111 | 196.497 |
| 0.7243055555555555 | 196.497 |
| 0.725 | 196.497 |
| 0.7256944444444445 | 196.497 |
| 0.7263888888888889 | 196.497 |
| 0.7270833333333333 | 191.937 |
| 0.7277777777777777 | 191.937 |
| 0.7284722222222223 | 191.937 |
| 0.7291666666666666 | 187.378 |
| 0.7298611111111111 | 187.378 |
| 0.7305555555555556 | 191.937 |
| 0.7312500000000001 | 187.378 |
| 0.7319444444444444 | 187.378 |
| 0.7326388888888888 | 182.82 |
| 0.7333333333333334 | 182.82 |
| 0.7340277777777778 | 182.82 |
| 0.7347222222222222 | 182.82 |
| 0.7354166666666666 | 182.82 |
| 0.7361111111111112 | 182.82 |
| 0.7368055555555556 | 178.264 |
| 0.7374999999999999 | 178.264 |
| 0.7381944444444444 | 178.264 |
| 0.7388888888888889 | 178.264 |
| 0.7395833333333334 | 178.264 |
| 0.7402777777777777 | 173.709 |
| 0.7409722222222223 | 173.709 |
| 0.7416666666666667 | 173.709 |
| 0.7423611111111111 | 173.709 |
| 0.7430555555555555 | 169.156 |
| 0.74375 | 169.156 |
| 0.7444444444444445 | 169.156 |
| 0.7451388888888889 | 169.156 |
| 0.7458333333333332 | 164.605 |
| 0.7465277777777778 | 164.605 |
| 0.7472222222222222 | 164.605 |
| 0.7479166666666667 | 164.605 |
| 0.748611111111111 | 160.056 |
| 0.7493055555555556 | 160.056 |
| 0.75 | 160.056 |
| 0.7506944444444444 | 160.056 |
| 0.751388888888889 | 160.056 |
| 0.7520833333333333 | 155.509 |
| 0.7527777777777778 | 155.509 |
| 0.7534722222222222 | 155.509 |
| 0.7541666666666668 | 155.509 |
| 0.7548611111111111 | 150.964 |
| 0.7555555555555555 | 150.964 |
| 0.75625 | 150.964 |
| 0.7569444444444445 | 150.964 |
| 0.7576388888888889 | 146.423 |
| 0.7583333333333333 | 146.423 |
| 0.7590277777777777 | 146.423 |
| 0.7597222222222223 | 146.423 |
| 0.7604166666666666 | 146.423 |
| 0.7611111111111111 | 146.423 |
| 0.7618055555555556 | 141.884 |
| 0.7625000000000001 | 141.884 |
| 0.7631944444444444 | 141.884 |
| 0.7638888888888888 | 141.884 |
| 0.7645833333333334 | 137.347 |
| 0.7652777777777778 | 137.347 |
| 0.7659722222222222 | 105.69 |
| 0.7666666666666666 | 132.814 |
| 0.7673611111111112 | 137.347 |
| 0.7680555555555556 | 137.347 |
| 0.7687499999999999 | 132.814 |
| 0.7694444444444444 | 132.814 |
| 0.7701388888888889 | 132.814 |
| 0.7708333333333334 | 132.814 |
| 0.7715277777777777 | 132.814 |
| 0.7722222222222223 | 132.814 |
| 0.7729166666666667 | 132.814 |
| 0.7736111111111111 | 128.284 |
| 0.7743055555555555 | 128.284 |
| 0.775 | 128.284 |
| 0.7756944444444445 | 128.284 |
| 0.7763888888888889 | 128.284 |
| 0.7770833333333332 | 123.758 |
| 0.7777777777777778 | 123.758 |
| 0.7784722222222222 | 119.235 |
| 0.7791666666666667 | 119.235 |
| 0.779861111111111 | 119.235 |
| 0.7805555555555556 | 114.716 |
| 0.78125 | 114.716 |
| 0.7819444444444444 | 114.716 |
| 0.782638888888889 | 110.201 |
| 0.7833333333333333 | 110.201 |
| 0.7840277777777778 | 110.201 |
| 0.7847222222222222 | 110.201 |
| 0.7854166666666668 | 110.201 |
| 0.7861111111111111 | 110.201 |
| 0.7868055555555555 | 110.201 |
| 0.7875 | 110.201 |
| 0.7881944444444445 | 105.69 |
| 0.7888888888888889 | 105.69 |
| 0.7895833333333333 | 101.184 |
| 0.7902777777777777 | 101.184 |
| 0.7909722222222223 | 101.184 |
| 0.7916666666666666 | 101.184 |
| 0.7923611111111111 | 96.682 |
| 0.7930555555555556 | 96.682 |
| 0.7937500000000001 | 96.682 |
| 0.7944444444444444 | 96.682 |
| 0.7951388888888888 | 92.184 |
| 0.7958333333333334 | 92.184 |
| 0.7965277777777778 | 92.184 |
| 0.7972222222222222 | 92.184 |
| 0.7979166666666666 | 87.692 |
| 0.7986111111111112 | 87.692 |
| 0.7993055555555556 | 87.692 |
| 0.7999999999999999 | 87.692 |
| 0.8006944444444444 | 87.692 |
| 0.8013888888888889 | 83.205 |
| 0.8020833333333334 | 83.205 |
| 0.8027777777777777 | 83.205 |
| 0.8034722222222223 | 83.205 |
| 0.8041666666666667 | 83.205 |
| 0.8048611111111111 | 83.205 |
| 0.8055555555555555 | 78.722 |
| 0.80625 | 78.722 |
| 0.8069444444444445 | 78.722 |
| 0.8076388888888889 | 74.246 |
| 0.8083333333333332 | 74.246 |
| 0.8090277777777778 | 74.246 |
| 0.8097222222222222 | 74.246 |
| 0.8104166666666667 | 74.246 |
| 0.811111111111111 | 69.775 |
| 0.8118055555555556 | 69.775 |
| 0.8125 | 69.775 |
| 0.8131944444444444 | 65.31 |
| 0.813888888888889 | 65.31 |
| 0.8145833333333333 | 65.31 |
| 0.8152777777777778 | 65.31 |
| 0.8159722222222222 | 60.85 |
| 0.8166666666666668 | 60.85 |
| 0.8173611111111111 | 60.85 |
| 0.8180555555555555 | 60.85 |
| 0.81875 | 56.398 |
| 0.8194444444444445 | 56.398 |
| 0.8201388888888889 | 56.398 |
| 0.8208333333333333 | 56.398 |
| 0.8215277777777777 | 51.951 |
| 0.8222222222222223 | 51.951 |
| 0.8229166666666666 | 51.951 |
| 0.8236111111111111 | 51.951 |
| 0.8243055555555556 | 47.511 |
| 0.8250000000000001 | 47.511 |
| 0.8256944444444444 | 47.511 |
| 0.8263888888888888 | 47.511 |
| 0.8270833333333334 | 43.079 |
| 0.8277777777777778 | 43.079 |
| 0.8284722222222222 | 43.079 |
| 0.8291666666666666 | 38.653 |
| 0.8298611111111112 | 38.653 |
| 0.8305555555555556 | 38.653 |
| 0.8312499999999999 | 38.653 |
| 0.8319444444444444 | 38.653 |
| 0.8326388888888889 | 34.234 |
| 0.8333333333333334 | 34.234 |
| 0.8340277777777777 | 34.234 |
| 0.8347222222222223 | 29.823 |
| 0.8354166666666667 | 29.823 |
| 0.8361111111111111 | 29.823 |
| 0.8368055555555555 | 29.823 |
| 0.8375 | 25.419 |
| 0.8381944444444445 | 25.419 |
| 0.8388888888888889 | 25.419 |
| 0.8395833333333332 | 21.024 |
| 0.8402777777777778 | 21.024 |
| 0.8409722222222222 | 21.024 |
| 0.8416666666666667 | 21.024 |
| 0.842361111111111 | 21.024 |
| 0.8430555555555556 | 16.636 |
| 0.84375 | 16.636 |
| 0.8444444444444444 | 16.636 |
| 0.845138888888889 | 16.636 |
| 0.8458333333333333 | 12.257 |
| 0.8465277777777778 | 12.257 |
| 0.8472222222222222 | 12.257 |
| 0.8479166666666668 | 12.257 |
| 0.8486111111111111 | 12.257 |
| 0.8493055555555555 | 7.887 |
| 0.85 | 7.887 |
| 0.8506944444444445 | 7.887 |
| 0.8513888888888889 | 7.887 |
| 0.8520833333333333 | 3.525 |
| 0.8527777777777777 | 3.525 |
| 0.8534722222222223 | 3.525 |
| 0.8541666666666666 | 3.525 |
| 0.8548611111111111 | 3.525 |
| 0.8555555555555556 | 3.525 |
| 0.8562500000000001 | 3.525 |
| 0.8569444444444444 | 3.525 |
| 0.8576388888888888 | 3.525 |
| 0.8583333333333334 | 0 |
| 0.8590277777777778 | 0 |
| 0.8597222222222222 | 0 |
| 0.8604166666666666 | 0 |
| 0.8611111111111112 | 0 |
| 0.8618055555555556 | 0 |
| 0.8624999999999999 | 0 |
| 0.8631944444444444 | 0 |
| 0.8638888888888889 | 0 |
| 0.8645833333333334 | 0 |
| 0.8652777777777777 | 0 |
| 0.8659722222222223 | 0 |
| 0.8666666666666667 | 0 |
| 0.8673611111111111 | 0 |
| 0.8680555555555555 | 0 |
| 0.86875 | 0 |
| 0.8694444444444445 | 0 |
| 0.8701388888888889 | 0 |
| 0.8708333333333332 | 0 |
| 0.8715277777777778 | 0 |
| 0.8722222222222222 | 0 |
| 0.8729166666666667 | 0 |
| 0.873611111111111 | 0 |
| 0.8743055555555556 | 0 |
| 0.875 | 0 |
| 0.8756944444444444 | 0 |
| 0.876388888888889 | 0 |
| 0.8770833333333333 | 0 |
| 0.8777777777777778 | 0 |
| 0.8784722222222222 | 0 |
| 0.8791666666666668 | 0 |
| 0.8798611111111111 | 0 |
| 0.8805555555555555 | 0 |
| 0.88125 | 0 |
| 0.8819444444444445 | 0 |
| 0.8826388888888889 | 0 |
| 0.8833333333333333 | 0 |
| 0.8840277777777777 | 0 |
| 0.8847222222222223 | 0 |
| 0.8854166666666666 | 0 |
| 0.8861111111111111 | 0 |
| 0.8868055555555556 | 0 |
| 0.8875000000000001 | 0 |
| 0.8881944444444444 | 0 |
| 0.8888888888888888 | 0 |
| 0.8895833333333334 | 0 |
| 0.8902777777777778 | 0 |
| 0.8909722222222222 | 0 |
| 0.8916666666666666 | 0 |
| 0.8923611111111112 | 0 |
| 0.8930555555555556 | 0 |
| 0.8937499999999999 | 0 |
| 0.8944444444444444 | 0 |
| 0.8951388888888889 | 0 |
| 0.8958333333333334 | 0 |
| 0.8965277777777777 | 0 |
| 0.8972222222222223 | 0 |
| 0.8979166666666667 | 0 |
| 0.8986111111111111 | 0 |
| 0.8993055555555555 | 0 |
| 0.9 | 0 |
| 0.9006944444444445 | 0 |
| 0.9013888888888889 | 0 |
| 0.9020833333333332 | 0 |
| 0.9027777777777778 | 0 |
| 0.9034722222222222 | 0 |
| 0.9041666666666667 | 0 |
| 0.904861111111111 | 0 |
| 0.9055555555555556 | 0 |
| 0.90625 | 0 |
| 0.9069444444444444 | 0 |
| 0.907638888888889 | 0 |
| 0.9083333333333333 | 0 |
| 0.9090277777777778 | 0 |
| 0.9097222222222222 | 0 |
| 0.9104166666666668 | 0 |
| 0.9111111111111111 | 0 |
| 0.9118055555555555 | 0 |
| 0.9125 | 0 |
| 0.9131944444444445 | 0 |
| 0.9138888888888889 | 0 |
| 0.9145833333333333 | 0 |
| 0.9152777777777777 | 0 |
| 0.9159722222222223 | 0 |
| 0.9166666666666666 | 0 |
| 0.9173611111111111 | 0 |
| 0.9180555555555556 | 0 |
| 0.9187500000000001 | 0 |
| 0.9194444444444444 | 0 |
| 0.9201388888888888 | 0 |
| 0.9208333333333334 | 0 |
| 0.9215277777777778 | 0 |
| 0.9222222222222222 | 0 |
| 0.9229166666666666 | 0 |
| 0.9236111111111112 | 0 |
| 0.9243055555555556 | 0 |
| 0.9249999999999999 | 0 |
| 0.9256944444444444 | 0 |
| 0.9263888888888889 | 0 |
| 0.9270833333333334 | 0 |
| 0.9277777777777777 | 0 |
| 0.9284722222222223 | 0 |
| 0.9291666666666667 | 0 |
| 0.9298611111111111 | 0 |
| 0.9305555555555555 | 0 |
| 0.93125 | 0 |
| 0.9319444444444445 | 0 |
| 0.9326388888888889 | 0 |
| 0.9333333333333332 | 0 |
| 0.9340277777777778 | 0 |
| 0.9347222222222222 | 0 |
| 0.9354166666666667 | 0 |
| 0.936111111111111 | 0 |
| 0.9368055555555556 | 0 |
| 0.9375 | 0 |
| 0.9381944444444444 | 0 |
| 0.938888888888889 | 0 |
| 0.9395833333333333 | 0 |
| 0.9402777777777778 | 0 |
| 0.9409722222222222 | 0 |
| 0.9416666666666668 | 0 |
| 0.9423611111111111 | 0 |
| 0.9430555555555555 | 0 |
| 0.94375 | 0 |
| 0.9444444444444445 | 0 |
| 0.9451388888888889 | 0 |
| 0.9458333333333333 | 0 |
| 0.9465277777777777 | 0 |
| 0.9472222222222223 | 0 |
| 0.9479166666666666 | 0 |
| 0.9486111111111111 | 0 |
| 0.9493055555555556 | 0 |
| 0.9500000000000001 | 0 |
| 0.9506944444444444 | 0 |
| 0.9513888888888888 | 0 |
| 0.9520833333333334 | 0 |
| 0.9527777777777778 | 0 |
| 0.9534722222222222 | 0 |
| 0.9541666666666666 | 0 |
| 0.9548611111111112 | 0 |
| 0.9555555555555556 | 0 |
| 0.9562499999999999 | 0 |
| 0.9569444444444444 | 0 |
| 0.9576388888888889 | 0 |
| 0.9583333333333334 | 0 |
| 0.9590277777777777 | 0 |
| 0.9597222222222223 | 0 |
| 0.9604166666666667 | 0 |
| 0.9611111111111111 | 0 |
| 0.9618055555555555 | 0 |
| 0.9625 | 0 |
| 0.9631944444444445 | 0 |
| 0.9638888888888889 | 0 |
| 0.9645833333333332 | 0 |
| 0.9652777777777778 | 0 |
| 0.9659722222222222 | 0 |
| 0.9666666666666667 | 0 |
| 0.967361111111111 | 0 |
| 0.9680555555555556 | 0 |
| 0.96875 | 0 |
| 0.9694444444444444 | 0 |
| 0.970138888888889 | 0 |
| 0.9708333333333333 | 0 |
| 0.9715277777777778 | 0 |
| 0.9722222222222222 | 0 |
| 0.9729166666666668 | 0 |
| 0.9736111111111111 | 0 |
| 0.9743055555555555 | 0 |
| 0.975 | 0 |
| 0.9756944444444445 | 0 |
| 0.9763888888888889 | 0 |
| 0.9770833333333333 | 0 |
| 0.9777777777777777 | 0 |
| 0.9784722222222223 | 0 |
| 0.9791666666666666 | 0 |
| 0.9798611111111111 | 0 |
| 0.9805555555555556 | 0 |
| 0.9812500000000001 | 0 |
| 0.9819444444444444 | 0 |
| 0.9826388888888888 | 0 |
| 0.9833333333333334 | 0 |
| 0.9840277777777778 | 0 |
| 0.9847222222222222 | 0 |
| 0.9854166666666666 | 0 |
| 0.9861111111111112 | 0 |
| 0.9868055555555556 | 0 |
| 0.9874999999999999 | 0 |
| 0.9881944444444444 | 0 |
| 0.9888888888888889 | 0 |
| 0.9895833333333334 | 0 |
| 0.9902777777777777 | 0 |
| 0.9909722222222223 | 0 |
| 0.9916666666666667 | 0 |
| 0.9923611111111111 | 0 |
| 0.9930555555555555 | 0 |
| 0.99375 | 0 |
| 0.9944444444444445 | 0 |
| 0.9951388888888889 | 0 |
| 0.9958333333333332 | 0 |
| 0.9965277777777778 | 0 |
| 0.9972222222222222 | 0 |
| 0.9979166666666667 | 0 |
| 0.998611111111111 | 0 |
| 0.9993055555555556 | 0 |